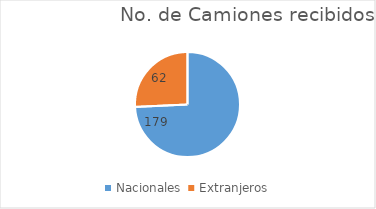
| Category | Total General  |
|---|---|
| Nacionales  | 179 |
| Extranjeros | 62 |